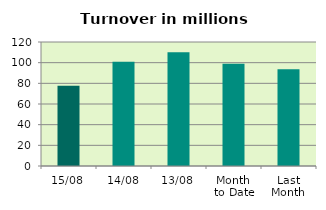
| Category | Series 0 |
|---|---|
| 15/08 | 77.59 |
| 14/08 | 101.002 |
| 13/08 | 110.163 |
| Month 
to Date | 98.929 |
| Last
Month | 93.691 |